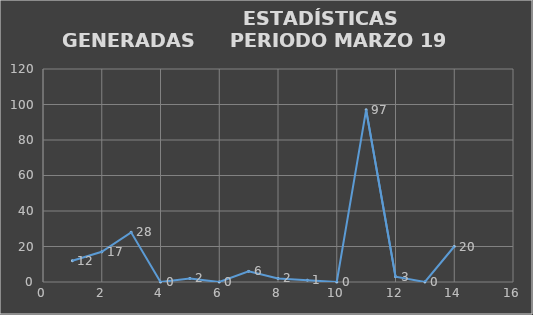
| Category |                   ESTADÍSTICAS GENERADAS  |
|---|---|
| 0 | 12 |
| 1 | 17 |
| 2 | 28 |
| 3 | 0 |
| 4 | 2 |
| 5 | 0 |
| 6 | 6 |
| 7 | 2 |
| 8 | 1 |
| 9 | 0 |
| 10 | 97 |
| 11 | 3 |
| 12 | 0 |
| 13 | 20 |